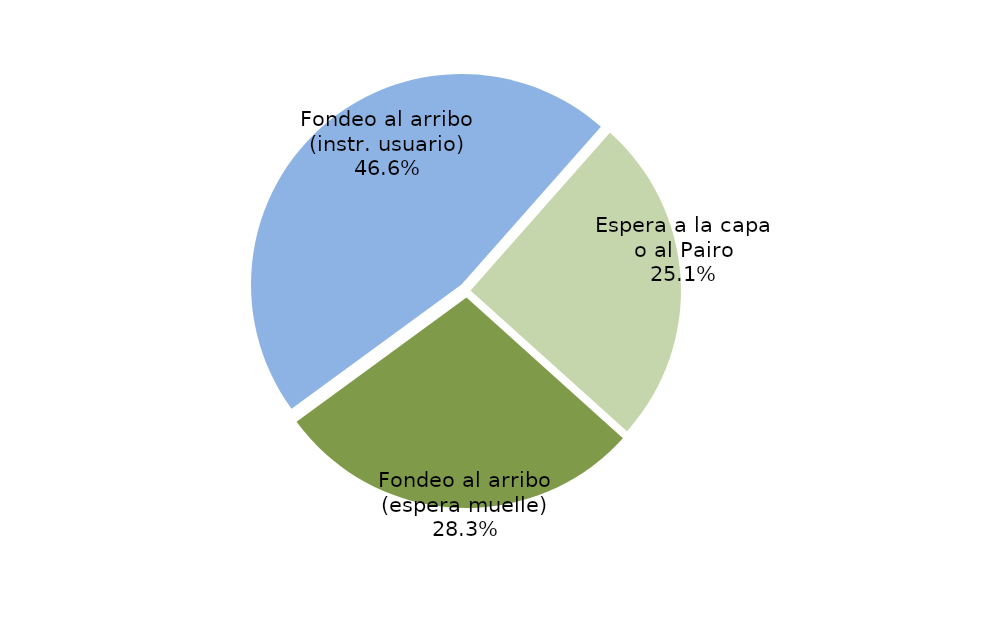
| Category | Series 0 |
|---|---|
| Fondeo al arribo (espera muelle) | 4893.443 |
| Fondeo al arribo (instr. usuario) | 8055.967 |
| Espera a la capa o al Pairo | 4350.233 |